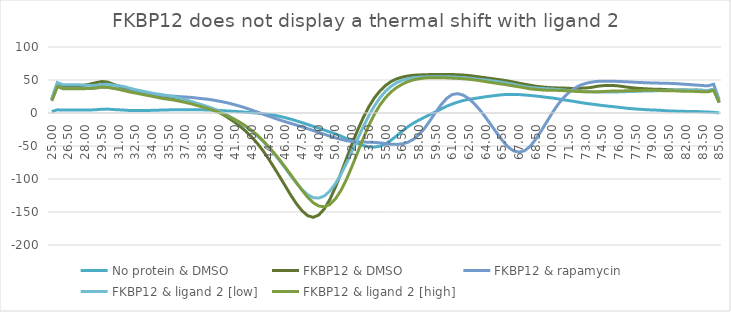
| Category | No protein & DMSO | FKBP12 & DMSO | FKBP12 & rapamycin | FKBP12 & ligand 2 [low] | FKBP12 & ligand 2 [high] |
|---|---|---|---|---|---|
| 25.0 | 2.229 | 20.756 | 18.619 | 21.319 | 18.446 |
| 25.5 | 4.83 | 44.971 | 40.341 | 46.192 | 39.966 |
| 26.0 | 4.459 | 41.512 | 37.238 | 42.639 | 36.891 |
| 26.5 | 4.459 | 41.512 | 37.238 | 42.639 | 36.891 |
| 27.0 | 4.459 | 41.512 | 37.238 | 42.639 | 36.891 |
| 27.5 | 4.444 | 41.368 | 37.255 | 42.695 | 36.881 |
| 28.0 | 4.54 | 42.227 | 37.111 | 42.321 | 36.904 |
| 28.5 | 4.622 | 44.091 | 37.067 | 41.746 | 37.237 |
| 29.0 | 4.979 | 46.03 | 37.791 | 41.907 | 38.273 |
| 29.5 | 5.799 | 47.682 | 39.107 | 43.158 | 39.294 |
| 30.0 | 5.893 | 46.882 | 39.167 | 43.581 | 38.889 |
| 30.5 | 5.268 | 43.839 | 37.75 | 42.471 | 37.561 |
| 31.0 | 4.851 | 40.812 | 36.301 | 41.338 | 35.898 |
| 31.5 | 4.393 | 37.689 | 34.624 | 40.028 | 33.87 |
| 32.0 | 3.839 | 34.352 | 32.594 | 37.692 | 31.873 |
| 32.5 | 3.681 | 32.057 | 31.222 | 35.376 | 30.271 |
| 33.0 | 3.802 | 30.821 | 30.437 | 33.736 | 28.679 |
| 33.5 | 3.832 | 29.454 | 29.368 | 31.915 | 26.953 |
| 34.0 | 4.001 | 28.075 | 28.347 | 30.136 | 25.319 |
| 34.5 | 4.275 | 26.916 | 27.445 | 28.787 | 23.552 |
| 35.0 | 4.507 | 25.679 | 26.491 | 27.553 | 21.961 |
| 35.5 | 4.725 | 24.292 | 25.871 | 26.144 | 20.779 |
| 36.0 | 4.938 | 22.815 | 25.45 | 24.449 | 19.537 |
| 36.5 | 5.097 | 21.144 | 24.773 | 22.404 | 17.836 |
| 37.0 | 5.047 | 19.172 | 24.22 | 20.038 | 16.053 |
| 37.5 | 4.974 | 16.93 | 23.697 | 17.532 | 14.064 |
| 38.0 | 5.003 | 14.482 | 22.72 | 14.911 | 11.702 |
| 38.5 | 4.861 | 11.869 | 21.74 | 12.343 | 9.298 |
| 39.0 | 4.559 | 8.842 | 20.928 | 9.667 | 6.927 |
| 39.5 | 4.316 | 5.299 | 19.638 | 6.665 | 4.203 |
| 40.0 | 4.038 | 1.295 | 18.045 | 3.225 | 1.186 |
| 40.5 | 3.438 | -3.367 | 16.469 | -0.768 | -2.196 |
| 41.0 | 2.902 | -8.805 | 14.525 | -5.341 | -6.083 |
| 41.5 | 2.49 | -14.704 | 12.252 | -10.296 | -10.3 |
| 42.0 | 1.807 | -21.19 | 9.866 | -15.565 | -14.952 |
| 42.5 | 1.038 | -28.565 | 7.218 | -21.447 | -20.472 |
| 43.0 | 0.541 | -36.93 | 4.335 | -27.869 | -26.788 |
| 43.5 | -0.14 | -46.424 | 1.366 | -34.95 | -33.835 |
| 44.0 | -1.158 | -57.453 | -1.776 | -43.045 | -42.099 |
| 44.5 | -2.082 | -69.811 | -4.837 | -52.189 | -51.256 |
| 45.0 | -3.345 | -83.089 | -7.723 | -62.114 | -60.91 |
| 45.5 | -5.16 | -96.832 | -10.61 | -72.731 | -71.239 |
| 46.0 | -7.154 | -110.918 | -13.26 | -84.012 | -82.376 |
| 46.5 | -9.38 | -124.925 | -15.763 | -95.542 | -93.911 |
| 47.0 | -11.919 | -137.674 | -18.398 | -106.445 | -105.574 |
| 47.5 | -14.573 | -148.147 | -21.049 | -116.076 | -117.073 |
| 48.0 | -17.427 | -155.521 | -23.681 | -123.716 | -127.61 |
| 48.5 | -20.297 | -158.083 | -26.508 | -128.212 | -135.886 |
| 49.0 | -22.972 | -154.548 | -29.398 | -128.927 | -140.896 |
| 49.5 | -25.863 | -145.311 | -32.246 | -125.694 | -142.154 |
| 50.0 | -28.851 | -130.963 | -35.093 | -118.218 | -138.639 |
| 50.5 | -31.672 | -112.298 | -37.615 | -107.009 | -130.112 |
| 51.0 | -34.962 | -91.052 | -39.972 | -92.78 | -117.162 |
| 51.5 | -38.821 | -68.696 | -41.887 | -75.903 | -100.266 |
| 52.0 | -42.542 | -46.537 | -43.088 | -57.558 | -80.411 |
| 52.5 | -46.047 | -25.716 | -43.722 | -39.029 | -59.386 |
| 53.0 | -49.295 | -6.946 | -44.069 | -20.946 | -38.542 |
| 53.5 | -51.322 | 9.398 | -44.201 | -4.081 | -18.998 |
| 54.0 | -51.685 | 22.876 | -44.546 | 10.687 | -2.035 |
| 54.5 | -50.279 | 33.46 | -45.251 | 23.073 | 11.942 |
| 55.0 | -46.733 | 41.583 | -46.189 | 32.95 | 23.19 |
| 55.5 | -41.184 | 47.651 | -47.231 | 40.442 | 32.023 |
| 56.0 | -34.566 | 51.761 | -47.604 | 45.92 | 38.611 |
| 56.5 | -27.541 | 54.294 | -46.821 | 49.526 | 43.579 |
| 57.0 | -20.929 | 56.094 | -44.479 | 51.807 | 47.486 |
| 57.5 | -15.403 | 57.229 | -39.932 | 53.292 | 50.162 |
| 58.0 | -10.773 | 57.674 | -32.986 | 54.211 | 51.855 |
| 58.5 | -6.494 | 57.933 | -23.463 | 54.657 | 53.019 |
| 59.0 | -2.387 | 58.228 | -11.635 | 54.949 | 53.58 |
| 59.5 | 1.737 | 58.257 | 0.887 | 54.999 | 53.529 |
| 60.0 | 6.124 | 58.224 | 12.483 | 54.968 | 53.444 |
| 60.5 | 10.262 | 58.308 | 22.184 | 54.916 | 53.216 |
| 61.0 | 13.637 | 58.275 | 28.027 | 54.669 | 52.818 |
| 61.5 | 16.485 | 57.917 | 29.283 | 54.149 | 52.425 |
| 62.0 | 18.961 | 57.453 | 26.984 | 53.619 | 51.903 |
| 62.5 | 20.633 | 56.758 | 21.612 | 52.876 | 51.169 |
| 63.0 | 21.939 | 55.638 | 13.751 | 51.836 | 50.182 |
| 63.5 | 23.366 | 54.48 | 4.296 | 50.847 | 48.983 |
| 64.0 | 24.645 | 53.443 | -6.558 | 49.918 | 47.574 |
| 64.5 | 25.66 | 52.276 | -18.451 | 48.823 | 46.245 |
| 65.0 | 26.742 | 51.05 | -30.172 | 47.763 | 44.96 |
| 65.5 | 27.702 | 49.883 | -41.444 | 46.547 | 43.784 |
| 66.0 | 28.145 | 48.543 | -51.151 | 45.019 | 42.405 |
| 66.5 | 28.209 | 46.901 | -57.299 | 43.451 | 41.021 |
| 67.0 | 27.922 | 45.198 | -59.207 | 41.766 | 39.71 |
| 67.5 | 27.33 | 43.608 | -57.144 | 40.055 | 38.13 |
| 68.0 | 26.585 | 42.092 | -50.586 | 38.798 | 36.603 |
| 68.5 | 25.771 | 40.599 | -39.949 | 37.852 | 35.716 |
| 69.0 | 24.72 | 39.6 | -27.023 | 37.124 | 35.108 |
| 69.5 | 23.698 | 38.871 | -13.261 | 36.75 | 34.475 |
| 70.0 | 22.733 | 38.268 | 0.343 | 36.293 | 34.332 |
| 70.5 | 21.406 | 38.008 | 12.819 | 35.614 | 34.274 |
| 71.0 | 19.992 | 37.878 | 23.21 | 34.914 | 33.894 |
| 71.5 | 18.754 | 37.335 | 31.292 | 34.054 | 33.478 |
| 72.0 | 17.431 | 37.226 | 37.48 | 33.253 | 33.074 |
| 72.5 | 15.931 | 37.577 | 42.084 | 32.707 | 32.45 |
| 73.0 | 14.641 | 37.897 | 44.929 | 32.276 | 32.056 |
| 73.5 | 13.571 | 38.769 | 46.662 | 32.023 | 32.024 |
| 74.0 | 12.446 | 40.392 | 47.828 | 31.881 | 32.144 |
| 74.5 | 11.363 | 41.415 | 48.276 | 31.799 | 32.462 |
| 75.0 | 10.415 | 41.657 | 48.232 | 31.8 | 32.981 |
| 75.5 | 9.562 | 41.632 | 48.07 | 31.888 | 33.318 |
| 76.0 | 8.593 | 40.961 | 47.801 | 32.007 | 33.415 |
| 76.5 | 7.601 | 39.753 | 47.378 | 32.291 | 33.535 |
| 77.0 | 6.712 | 38.581 | 47.004 | 32.548 | 33.884 |
| 77.5 | 6.035 | 37.696 | 46.524 | 32.744 | 34.237 |
| 78.0 | 5.477 | 37.077 | 46.118 | 33.084 | 34.245 |
| 78.5 | 4.899 | 36.582 | 45.771 | 33.309 | 34.452 |
| 79.0 | 4.575 | 36.147 | 45.509 | 33.474 | 34.643 |
| 79.5 | 4.275 | 35.983 | 45.287 | 33.815 | 34.225 |
| 80.0 | 3.702 | 35.708 | 45.129 | 34.19 | 33.716 |
| 80.5 | 3.137 | 35.219 | 44.933 | 34.366 | 33.794 |
| 81.0 | 2.892 | 34.944 | 44.557 | 34.639 | 33.604 |
| 81.5 | 2.65 | 34.939 | 44.062 | 34.928 | 33.145 |
| 82.0 | 2.417 | 34.7 | 43.464 | 34.902 | 33.063 |
| 82.5 | 2.321 | 34.561 | 42.806 | 34.779 | 32.936 |
| 83.0 | 2.182 | 34.723 | 42.279 | 34.689 | 32.56 |
| 83.5 | 1.748 | 34.32 | 41.579 | 34.288 | 32.188 |
| 84.0 | 1.454 | 33.997 | 41.148 | 33.982 | 32.105 |
| 84.5 | 0.935 | 35.795 | 43.602 | 36.119 | 34.352 |
| 85.0 | 0.139 | 15.972 | 19.658 | 16.31 | 15.666 |